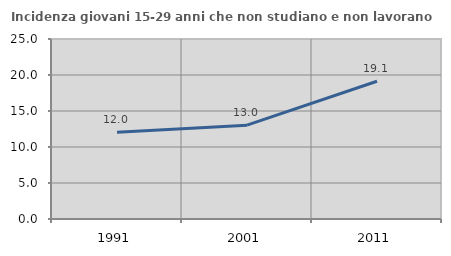
| Category | Incidenza giovani 15-29 anni che non studiano e non lavorano  |
|---|---|
| 1991.0 | 12.035 |
| 2001.0 | 13.031 |
| 2011.0 | 19.127 |